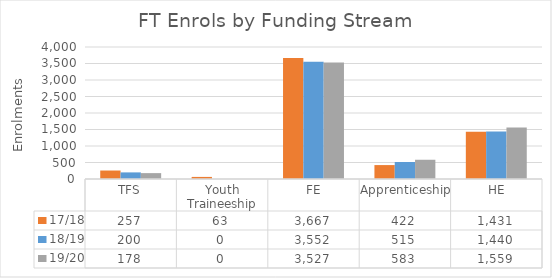
| Category | 17/18 | 18/19 | 19/20 |
|---|---|---|---|
| TFS | 257 | 200 | 178 |
| Youth Traineeship | 63 | 0 | 0 |
|  FE | 3667 | 3552 | 3527 |
| Apprenticeship | 422 | 515 | 583 |
|  HE | 1431 | 1440 | 1559 |